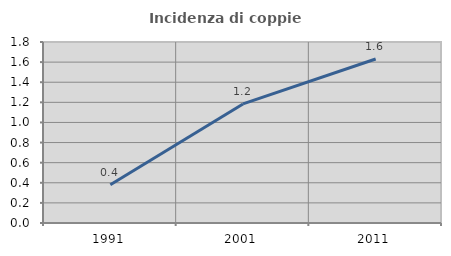
| Category | Incidenza di coppie miste |
|---|---|
| 1991.0 | 0.38 |
| 2001.0 | 1.184 |
| 2011.0 | 1.631 |